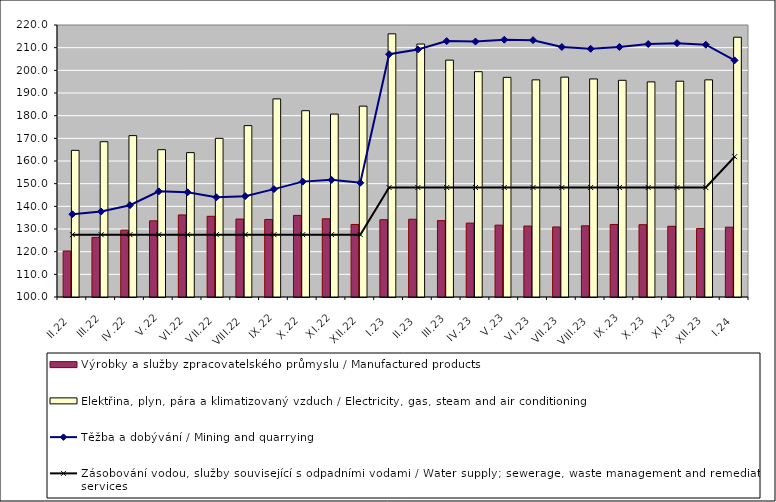
| Category | Výrobky a služby zpracovatelského průmyslu / Manufactured products | Elektřina, plyn, pára a klimatizovaný vzduch / Electricity, gas, steam and air conditioning |
|---|---|---|
| II.22 | 120.3 | 164.7 |
| III.22 | 126.3 | 168.5 |
| IV.22 | 129.5 | 171.2 |
| V.22 | 133.6 | 165 |
| VI.22 | 136.2 | 163.7 |
| VII.22 | 135.6 | 170 |
| VIII.22 | 134.4 | 175.6 |
| IX.22 | 134.2 | 187.4 |
| X.22 | 136 | 182.2 |
| XI.22 | 134.5 | 180.7 |
| XII.22 | 132 | 184.2 |
| I.23 | 134.1 | 216.1 |
| II.23 | 134.3 | 211.6 |
| III.23 | 133.7 | 204.5 |
| IV.23 | 132.6 | 199.4 |
| V.23 | 131.7 | 196.9 |
| VI.23 | 131.3 | 195.8 |
| VII.23 | 130.9 | 197 |
| VIII.23 | 131.4 | 196.2 |
| IX.23 | 132 | 195.6 |
| X.23 | 131.9 | 194.9 |
| XI.23 | 131.2 | 195.2 |
| XII.23 | 130.2 | 195.8 |
| I.24 | 130.8 | 214.6 |